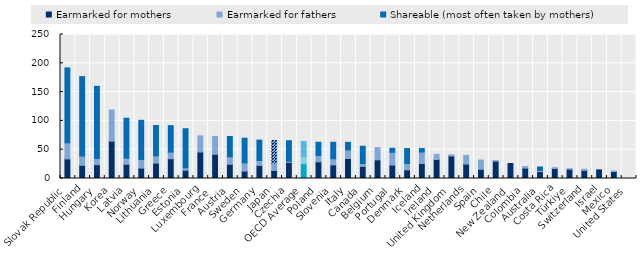
| Category | Earmarked for mothers | Earmarked for fathers | Shareable (most often taken by mothers) |
|---|---|---|---|
| Slovak Republic | 34 | 28 | 130 |
| Finland | 22.837 | 16.166 | 137.833 |
| Hungary | 24 | 10.8 | 125.2 |
| Korea | 64.857 | 54 | 0 |
| Latvia | 24.666 | 10.666 | 69.333 |
| Norway | 18 | 15 | 68 |
| Lithuania | 26.666 | 12.666 | 52.667 |
| Greece | 34.334 | 11.467 | 45.933 |
| Estonia | 14.286 | 4.286 | 67.857 |
| Luxembourg | 46 | 28 | 0 |
| France  | 42 | 31 | 0 |
| Austria | 24.667 | 12.997 | 35.333 |
| Sweden | 12.857 | 14.286 | 42.857 |
| Germany | 22.667 | 8.7 | 35.333 |
| Japan | 14 | 12.66 | 39.34 |
| Czechia | 28 | 2 | 35.645 |
| OECD Average | 25.685 | 12.678 | 25.932 |
| Poland | 29 | 11 | 23 |
| Slovenia | 23.571 | 10.714 | 28.571 |
| Italy | 34.7 | 15 | 13 |
| Canada | 21 | 5 | 30 |
| Belgium | 32.333 | 21.333 | 0 |
| Portugal | 23.286 | 22.286 | 6.854 |
| Denmark | 15 | 11 | 26 |
| Iceland | 26 | 20 | 6 |
| Ireland | 33 | 9 | 0 |
| United Kingdom | 39 | 2 | 0 |
| Netherlands | 25 | 15 | 0 |
| Spain | 16 | 16 | 0 |
| Chile | 30 | 1 | 0 |
| New Zealand | 26 | 0 | 0 |
| Colombia | 18 | 2.8 | 0 |
| Australia | 12 | 2 | 6 |
| Costa Rica | 17.32 | 1.6 | 0 |
| Türkiye | 16 | 1 | 0 |
| Switzerland | 14 | 2 | 0 |
| Israel | 15 | 0 | 0 |
| Mexico | 12 | 1 | 0 |
| United States | 0 | 0 | 0 |